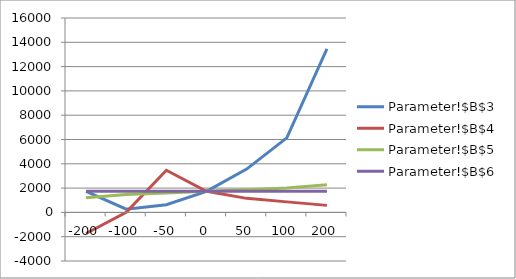
| Category | Parameter!$B$3 | Parameter!$B$4 | Parameter!$B$5 | Parameter!$B$6 |
|---|---|---|---|---|
| -200.0 | 1733.333 | -1733.333 | 1200 | 1733.333 |
| -100.0 | 266.667 | 0 | 1466.667 | 1733.333 |
| -50.0 | 633.333 | 3466.667 | 1600 | 1733.333 |
| 0.0 | 1733.333 | 1733.333 | 1733.333 | 1733.333 |
| 50.0 | 3566.667 | 1155.556 | 1866.667 | 1733.333 |
| 100.0 | 6133.333 | 866.667 | 2000 | 1733.333 |
| 200.0 | 13466.667 | 577.778 | 2266.667 | 1733.333 |